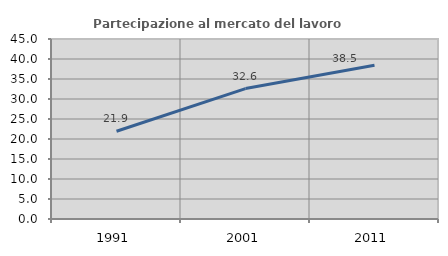
| Category | Partecipazione al mercato del lavoro  femminile |
|---|---|
| 1991.0 | 21.933 |
| 2001.0 | 32.601 |
| 2011.0 | 38.462 |